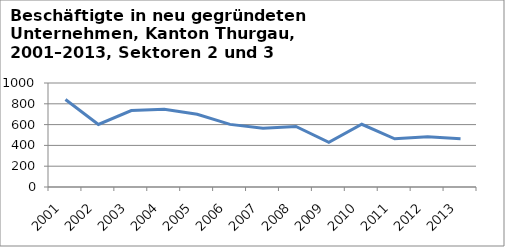
| Category | Sektoren 2 und 3 |
|---|---|
| 2001.0 | 841 |
| 2002.0 | 601 |
| 2003.0 | 735 |
| 2004.0 | 748 |
| 2005.0 | 699 |
| 2006.0 | 602 |
| 2007.0 | 565 |
| 2008.0 | 582 |
| 2009.0 | 430 |
| 2010.0 | 603 |
| 2011.0 | 463 |
| 2012.0 | 484 |
| 2013.0 | 465 |